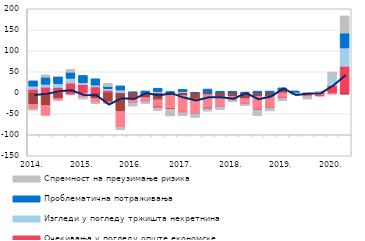
| Category | Трошкови извора за кредите | Конкуренција осталих банака | Очекивања у погледу опште економске ситуације | Изгледи у погледу тржишта некретнина | Проблематична потраживања | Спремност на преузимање ризика |
|---|---|---|---|---|---|---|
| 2014. | -27.614 | -10.883 | 8.513 | 7.366 | 12.572 | -2.931 |
|  | -30.154 | -23.565 | 13.381 | 6.958 | 16.79 | 5.591 |
|  | -13.58 | -4.04 | 12.84 | 8.698 | 16.68 | 1.322 |
|  | -3.194 | -0.943 | 23.215 | 11.346 | 14.413 | 6.815 |
| 2015. | 1.584 | -10.634 | 17.798 | 4.391 | 17.665 | -4.309 |
|  | -13.709 | -9.748 | 14.011 | 4.433 | 14.906 | -2.291 |
|  | -21.32 | -4.036 | 5.521 | 4.364 | 5.262 | 7.435 |
|  | -44.371 | -37.787 | 0.672 | 5.886 | 9.984 | -6.068 |
| 2016. | -13.683 | -9.865 | -0.183 | -2.017 | 2.537 | -5.896 |
|  | -11.339 | -9.602 | -0.197 | -1.974 | 4.34 | -2.332 |
|  | -16.54 | -16.708 | -2.652 | 2.885 | 8.061 | -6.073 |
|  | -6.439 | -30.804 | -2.596 | -1.957 | 3.101 | -13.396 |
| 2017. | -6.563 | -40.484 | -0.096 | 2.394 | 5.669 | -7.434 |
|  | -14.708 | -34.121 | -1.211 | -2.234 | 1.309 | -6.144 |
|  | -4.365 | -31.359 | -2.483 | -2.033 | 8.902 | -3.307 |
|  | -9.63 | -23.589 | -0.294 | -2.083 | 3.686 | -4.267 |
| 2018. | -8.401 | -9.465 | -0.308 | -2.087 | 3.545 | -0.758 |
|  | -13.817 | -13.719 | -0.384 | -1.143 | 1.627 | -1.188 |
|  | -8.391 | -32.723 | -0.405 | -2.001 | 3.96 | -10.656 |
|  | -8.386 | -28.581 | -0.415 | -2.043 | 4.097 | -3.682 |
| 2019. | 7.614 | -12.529 | -0.41 | -2.062 | 4.174 | -3.764 |
|  | -0.003 | 0 | -0.494 | 0 | 4.55 | -3.594 |
|  | -3.529 | -4.583 | -0.546 | 0 | 0 | -6.275 |
|  | -3.387 | -3.387 | -0.556 | 0 | 0 | 3.746 |
| 2020. | 0 | -3.3 | 17.776 | 18.324 | 0 | 13.5 |